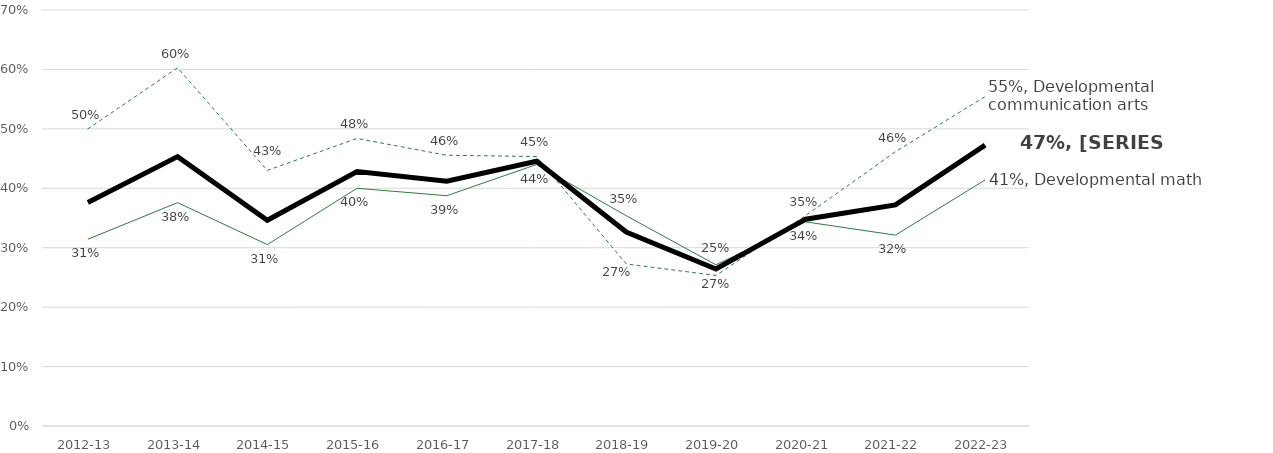
| Category | Communication arts | Math | Overall |
|---|---|---|---|
| 2012-13 | 0.5 | 0.314 | 0.376 |
| 2013-14 | 0.603 | 0.376 | 0.453 |
| 2014-15 | 0.43 | 0.305 | 0.346 |
| 2015-16 | 0.484 | 0.4 | 0.428 |
| 2016-17 | 0.456 | 0.388 | 0.412 |
| 2017-18 | 0.453 | 0.44 | 0.445 |
| 2018-19 | 0.273 | 0.354 | 0.327 |
| 2019-20 | 0.253 | 0.271 | 0.264 |
| 2020-21 | 0.354 | 0.344 | 0.348 |
| 2021-22 | 0.462 | 0.321 | 0.372 |
| 2022-23 | 0.554 | 0.414 | 0.473 |